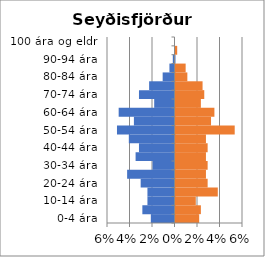
| Category | % karlar | %konur |
|---|---|---|
| 0-4 ára | -0.021 | 0.021 |
| 5-9 ára | -0.029 | 0.023 |
| 10-14 ára | -0.024 | 0.018 |
| 15-19 ára | -0.024 | 0.038 |
| 20-24 ára | -0.03 | 0.029 |
| 25-29 ára | -0.042 | 0.027 |
| 30-34 ára | -0.02 | 0.029 |
| 35-39 ára | -0.035 | 0.027 |
| 40-44 ára | -0.032 | 0.029 |
| 45-49 ára | -0.041 | 0.027 |
| 50-54 ára | -0.051 | 0.053 |
| 55-59 ára | -0.036 | 0.032 |
| 60-64 ára | -0.05 | 0.035 |
| 65-69 ára | -0.018 | 0.023 |
| 70-74 ára | -0.032 | 0.026 |
| 75-79 ára | -0.023 | 0.024 |
| 80-84 ára | -0.011 | 0.011 |
| 85-89 ára | -0.005 | 0.009 |
| 90-94 ára | -0.002 | 0 |
| 95-99 ára | 0 | 0.002 |
| 100 ára og eldri | 0 | 0 |